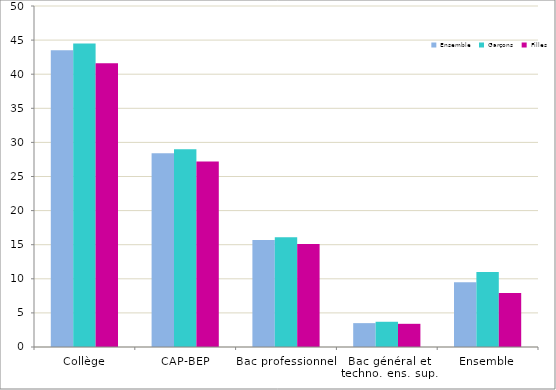
| Category | Ensemble | Garçons | Filles |
|---|---|---|---|
| Collège | 43.5 | 44.5 | 41.6 |
| CAP-BEP | 28.4 | 29 | 27.2 |
| Bac professionnel | 15.7 | 16.1 | 15.1 |
| Bac général et techno. ens. sup. | 3.5 | 3.7 | 3.4 |
| Ensemble | 9.5 | 11 | 7.9 |